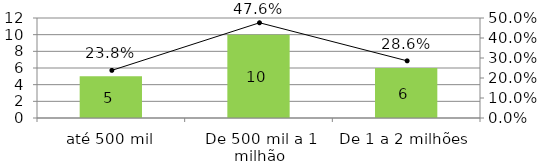
| Category | Quantidade de obras |
|---|---|
| até 500 mil | 5 |
| De 500 mil a 1 milhão | 10 |
| De 1 a 2 milhões  | 6 |